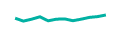
| Category | Series 0 |
|---|---|
| 0 | 0.088 |
| 1 | 0.059 |
| 2 | 0.078 |
| 3 | 0.102 |
| 4 | 0.062 |
| 5 | 0.078 |
| 6 | 0.081 |
| 7 | 0.063 |
| 8 | 0.078 |
| 9 | 0.096 |
| 10 | 0.104 |
| 11 | 0.12 |